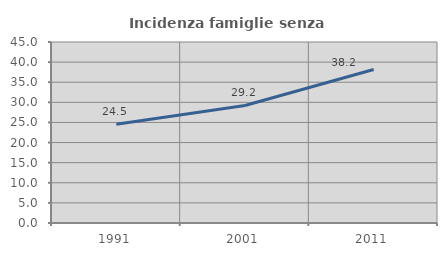
| Category | Incidenza famiglie senza nuclei |
|---|---|
| 1991.0 | 24.545 |
| 2001.0 | 29.213 |
| 2011.0 | 38.161 |